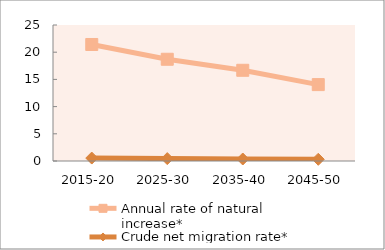
| Category | Annual rate of natural increase* | Crude net migration rate* |
|---|---|---|
| 2015-20 | 21.418 | 0.54 |
| 2025-30 | 18.703 | 0.44 |
| 2035-40 | 16.674 | 0.367 |
| 2045-50 | 14.045 | 0.314 |